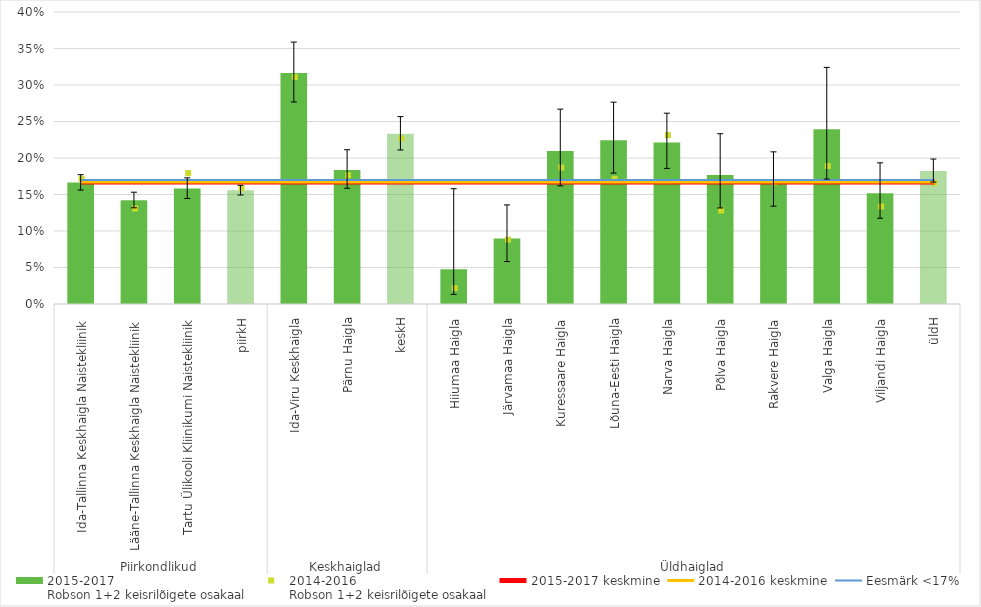
| Category | 2015-2017
Robson 1+2 keisrilõigete osakaal |
|---|---|
| 0 | 0.166 |
| 1 | 0.142 |
| 2 | 0.158 |
| 3 | 0.156 |
| 4 | 0.316 |
| 5 | 0.183 |
| 6 | 0.233 |
| 7 | 0.048 |
| 8 | 0.09 |
| 9 | 0.21 |
| 10 | 0.224 |
| 11 | 0.221 |
| 12 | 0.177 |
| 13 | 0.168 |
| 14 | 0.239 |
| 15 | 0.152 |
| 16 | 0.182 |